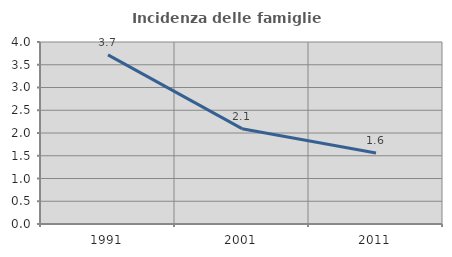
| Category | Incidenza delle famiglie numerose |
|---|---|
| 1991.0 | 3.717 |
| 2001.0 | 2.095 |
| 2011.0 | 1.562 |